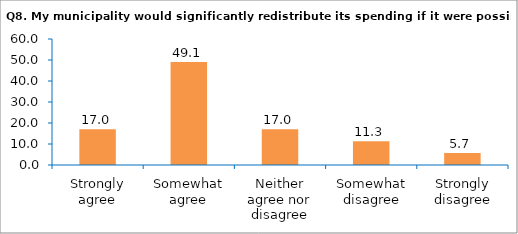
| Category | Series 0 |
|---|---|
| Strongly agree | 16.981 |
| Somewhat agree | 49.057 |
| Neither agree nor disagree | 16.981 |
| Somewhat disagree | 11.321 |
| Strongly disagree | 5.66 |